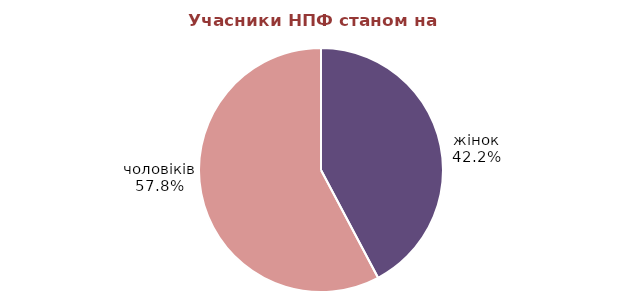
| Category | Series 0 |
|---|---|
| жінок | 368062 |
| чоловіків | 503141 |